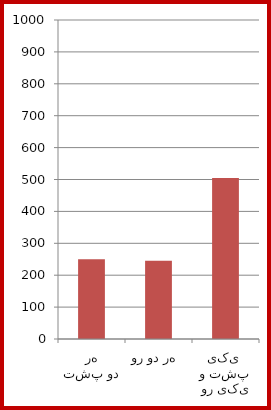
| Category | Series 0 |
|---|---|
| هر دو پشت | 250 |
| هر دو رو  | 245 |
| یکی پشت و یکی رو  | 505 |